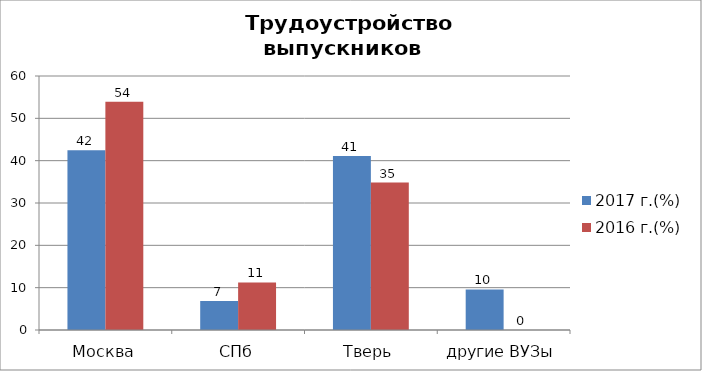
| Category | 2017 г.(%) | 2016 г.(%) |
|---|---|---|
| Москва | 42.466 | 53.933 |
| СПб | 6.849 | 11.236 |
| Тверь | 41.096 | 34.831 |
| другие ВУЗы | 9.589 | 0 |